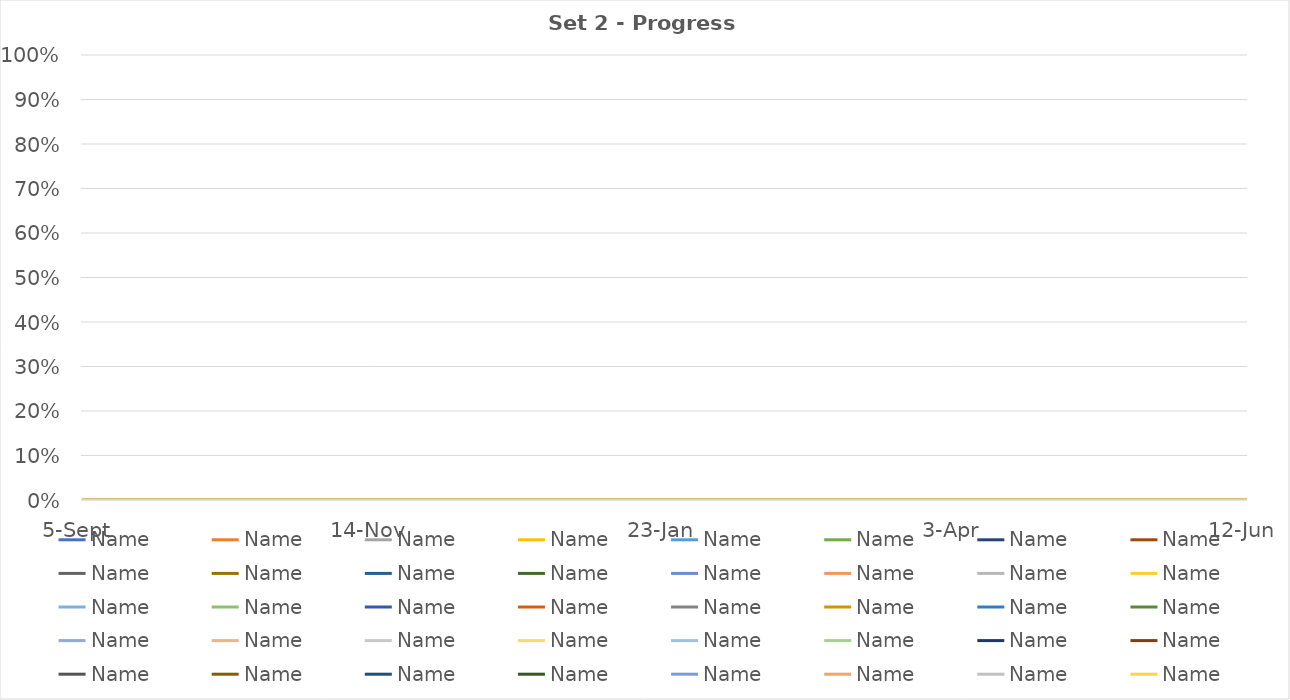
| Category | Name |
|---|---|
| 2022-09-05 | 0 |
| 2022-11-14 | 0 |
| 2023-01-23 | 0 |
| 2023-04-03 | 0 |
| 2023-06-12 | 0 |